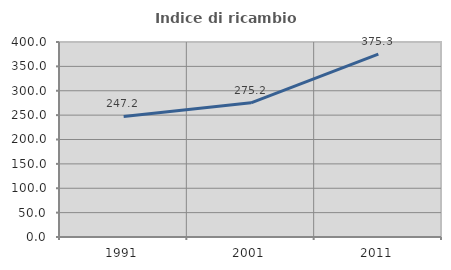
| Category | Indice di ricambio occupazionale  |
|---|---|
| 1991.0 | 247.249 |
| 2001.0 | 275.232 |
| 2011.0 | 375.254 |